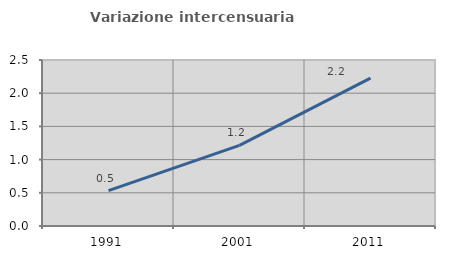
| Category | Variazione intercensuaria annua |
|---|---|
| 1991.0 | 0.534 |
| 2001.0 | 1.215 |
| 2011.0 | 2.227 |